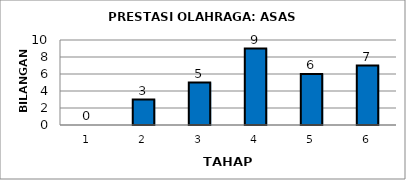
| Category | Series 0 |
|---|---|
| 1.0 | 0 |
| 2.0 | 3 |
| 3.0 | 5 |
| 4.0 | 9 |
| 5.0 | 6 |
| 6.0 | 7 |